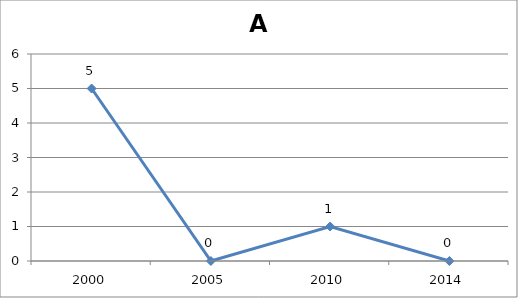
| Category | Regions with prev rate > 1/10000 |
|---|---|
| 2000.0 | 5 |
| 2005.0 | 0 |
| 2010.0 | 1 |
| 2014.0 | 0 |